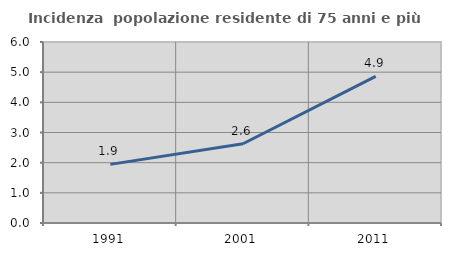
| Category | Incidenza  popolazione residente di 75 anni e più |
|---|---|
| 1991.0 | 1.943 |
| 2001.0 | 2.628 |
| 2011.0 | 4.859 |